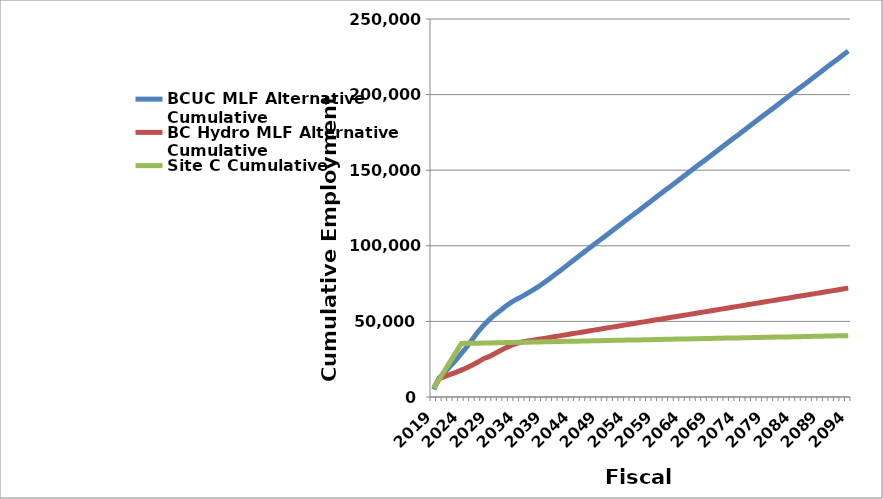
| Category | BCUC MLF Alternative Cumulative | BC Hydro MLF Alternative Cumulative | Site C Cumulative |
|---|---|---|---|
| 2019.0 | 4957.828 | 6079.592 | 5899.733 |
| 2020.0 | 12834.937 | 12159.184 | 11799.467 |
| 2021.0 | 16428.217 | 13534.948 | 17699.2 |
| 2022.0 | 20411.497 | 14910.711 | 23598.933 |
| 2023.0 | 24454.777 | 16286.475 | 29498.667 |
| 2024.0 | 28868.057 | 17801.241 | 35398.4 |
| 2025.0 | 33202.937 | 19316.007 | 35472.4 |
| 2026.0 | 38186.017 | 21208.973 | 35546.4 |
| 2027.0 | 43139.097 | 23101.939 | 35620.4 |
| 2028.0 | 47342.177 | 25317.305 | 35694.4 |
| 2029.0 | 50987.257 | 26672.671 | 35768.4 |
| 2030.0 | 54246.937 | 28652.637 | 35842.4 |
| 2031.0 | 57090.417 | 30567.803 | 35916.4 |
| 2032.0 | 59993.897 | 32482.969 | 35990.4 |
| 2033.0 | 62567.377 | 34132.735 | 36064.4 |
| 2034.0 | 64690.857 | 35513.701 | 36138.4 |
| 2035.0 | 66544.337 | 36379.067 | 36212.4 |
| 2036.0 | 68697.817 | 36983.033 | 36286.4 |
| 2037.0 | 70851.297 | 37586.999 | 36360.4 |
| 2038.0 | 73094.777 | 38190.965 | 36434.4 |
| 2039.0 | 75728.257 | 38794.931 | 36508.4 |
| 2040.0 | 78421.737 | 39398.897 | 36582.4 |
| 2041.0 | 81145.217 | 40002.863 | 36656.4 |
| 2042.0 | 83898.697 | 40606.829 | 36730.4 |
| 2043.0 | 86712.177 | 41210.795 | 36804.4 |
| 2044.0 | 89555.657 | 41814.761 | 36878.4 |
| 2045.0 | 92429.137 | 42418.727 | 36952.4 |
| 2046.0 | 95242.617 | 43022.693 | 37026.4 |
| 2047.0 | 98026.097 | 43626.659 | 37100.4 |
| 2048.0 | 100809.577 | 44230.625 | 37174.4 |
| 2049.0 | 103593.057 | 44834.591 | 37248.4 |
| 2050.0 | 106376.537 | 45438.557 | 37322.4 |
| 2051.0 | 109160.017 | 46042.523 | 37396.4 |
| 2052.0 | 111943.497 | 46646.489 | 37470.4 |
| 2053.0 | 114726.977 | 47250.455 | 37544.4 |
| 2054.0 | 117510.457 | 47854.421 | 37618.4 |
| 2055.0 | 120293.937 | 48458.387 | 37692.4 |
| 2056.0 | 123077.417 | 49062.353 | 37766.4 |
| 2057.0 | 125860.897 | 49666.319 | 37840.4 |
| 2058.0 | 128644.377 | 50270.285 | 37914.4 |
| 2059.0 | 131427.857 | 50874.251 | 37988.4 |
| 2060.0 | 134211.337 | 51478.217 | 38062.4 |
| 2061.0 | 136994.817 | 52082.183 | 38136.4 |
| 2062.0 | 139778.297 | 52686.149 | 38210.4 |
| 2063.0 | 142561.777 | 53290.115 | 38284.4 |
| 2064.0 | 145345.257 | 53894.081 | 38358.4 |
| 2065.0 | 148128.737 | 54498.047 | 38432.4 |
| 2066.0 | 150912.217 | 55102.013 | 38506.4 |
| 2067.0 | 153695.697 | 55705.979 | 38580.4 |
| 2068.0 | 156479.177 | 56309.945 | 38654.4 |
| 2069.0 | 159262.657 | 56913.911 | 38728.4 |
| 2070.0 | 162046.137 | 57517.877 | 38802.4 |
| 2071.0 | 164829.617 | 58121.843 | 38876.4 |
| 2072.0 | 167613.097 | 58725.809 | 38950.4 |
| 2073.0 | 170396.577 | 59329.775 | 39024.4 |
| 2074.0 | 173180.057 | 59933.741 | 39098.4 |
| 2075.0 | 175963.537 | 60537.707 | 39172.4 |
| 2076.0 | 178747.017 | 61141.673 | 39246.4 |
| 2077.0 | 181530.497 | 61745.639 | 39320.4 |
| 2078.0 | 184313.977 | 62349.605 | 39394.4 |
| 2079.0 | 187097.457 | 62953.571 | 39468.4 |
| 2080.0 | 189880.937 | 63557.537 | 39542.4 |
| 2081.0 | 192664.417 | 64161.503 | 39616.4 |
| 2082.0 | 195447.897 | 64765.469 | 39690.4 |
| 2083.0 | 198231.377 | 65369.435 | 39764.4 |
| 2084.0 | 201014.857 | 65973.401 | 39838.4 |
| 2085.0 | 203798.337 | 66577.367 | 39912.4 |
| 2086.0 | 206581.817 | 67181.333 | 39986.4 |
| 2087.0 | 209365.297 | 67785.299 | 40060.4 |
| 2088.0 | 212148.777 | 68389.265 | 40134.4 |
| 2089.0 | 214932.257 | 68993.231 | 40208.4 |
| 2090.0 | 217715.737 | 69597.197 | 40282.4 |
| 2091.0 | 220499.217 | 70201.163 | 40356.4 |
| 2092.0 | 223282.697 | 70805.129 | 40430.4 |
| 2093.0 | 226066.177 | 71409.095 | 40504.4 |
| 2094.0 | 228849.657 | 72013.061 | 40578.4 |